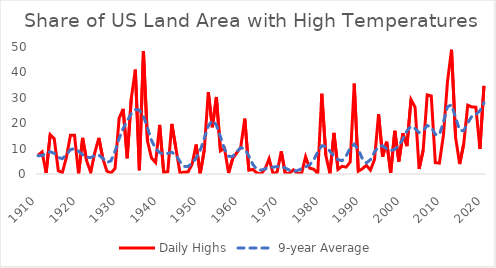
| Category | Daily Highs | 9-year Average |
|---|---|---|
| 1910.0 | 7.4 | 7.197 |
| 1911.0 | 8.7 | 7.289 |
| 1912.0 | 0.4 | 8.036 |
| 1913.0 | 15.5 | 8.762 |
| 1914.0 | 13.9 | 8.141 |
| 1915.0 | 1.3 | 6.507 |
| 1916.0 | 0.5 | 6.023 |
| 1917.0 | 6.6 | 7.627 |
| 1918.0 | 15.3 | 9.588 |
| 1919.0 | 15.3 | 9.991 |
| 1920.0 | 0 | 8.955 |
| 1921.0 | 14.2 | 7.581 |
| 1922.0 | 5.2 | 6.583 |
| 1923.0 | 0.6 | 6.497 |
| 1924.0 | 8.4 | 7.239 |
| 1925.0 | 14.2 | 7.458 |
| 1926.0 | 6 | 6.143 |
| 1927.0 | 1.1 | 4.544 |
| 1928.0 | 0.4 | 5.184 |
| 1929.0 | 2.2 | 8.953 |
| 1930.0 | 21.9 | 13.938 |
| 1931.0 | 25.6 | 17.943 |
| 1932.0 | 6.2 | 20.989 |
| 1933.0 | 29.7 | 23.688 |
| 1934.0 | 41.1 | 25.352 |
| 1935.0 | 1.5 | 25.167 |
| 1936.0 | 48.4 | 22.759 |
| 1937.0 | 13 | 18.183 |
| 1938.0 | 6.3 | 13.188 |
| 1939.0 | 4.5 | 9.952 |
| 1940.0 | 19.3 | 8.453 |
| 1941.0 | 0.7 | 7.822 |
| 1942.0 | 0.9 | 8.108 |
| 1943.0 | 19.7 | 8.57 |
| 1944.0 | 10.1 | 7.493 |
| 1945.0 | 0.5 | 4.936 |
| 1946.0 | 0.7 | 2.978 |
| 1947.0 | 0.8 | 2.959 |
| 1948.0 | 3.8 | 4.311 |
| 1949.0 | 11.6 | 6.232 |
| 1950.0 | 0.1 | 9.258 |
| 1951.0 | 9.3 | 13.994 |
| 1952.0 | 32.2 | 18.89 |
| 1953.0 | 18.4 | 21.081 |
| 1954.0 | 30.3 | 19.254 |
| 1955.0 | 9.1 | 14.645 |
| 1956.0 | 10.1 | 9.811 |
| 1957.0 | 0.4 | 6.966 |
| 1958.0 | 6 | 6.887 |
| 1959.0 | 8.3 | 8.712 |
| 1960.0 | 10.5 | 10.386 |
| 1961.0 | 21.8 | 9.892 |
| 1962.0 | 1.5 | 7.055 |
| 1963.0 | 1.8 | 3.739 |
| 1964.0 | 0.4 | 1.796 |
| 1965.0 | 0 | 1.514 |
| 1966.0 | 2 | 2.028 |
| 1967.0 | 6 | 2.475 |
| 1968.0 | 0 | 2.707 |
| 1969.0 | 0.9 | 2.938 |
| 1970.0 | 8.9 | 2.931 |
| 1971.0 | 0.1 | 2.344 |
| 1972.0 | 0.3 | 1.51 |
| 1973.0 | 1.6 | 1.083 |
| 1974.0 | 0.2 | 1.342 |
| 1975.0 | 0.2 | 2.082 |
| 1976.0 | 6.8 | 2.817 |
| 1977.0 | 2.3 | 3.604 |
| 1978.0 | 1.9 | 5.502 |
| 1979.0 | 0.2 | 8.716 |
| 1980.0 | 31.6 | 11.123 |
| 1981.0 | 7.3 | 10.882 |
| 1982.0 | 0.2 | 8.966 |
| 1983.0 | 16.2 | 7.085 |
| 1984.0 | 1.8 | 5.647 |
| 1985.0 | 3 | 5.242 |
| 1986.0 | 2.7 | 7.063 |
| 1987.0 | 4.7 | 10.31 |
| 1988.0 | 35.6 | 11.741 |
| 1989.0 | 1.1 | 9.599 |
| 1990.0 | 2.1 | 6.044 |
| 1991.0 | 3.4 | 4.356 |
| 1992.0 | 1.5 | 5.647 |
| 1993.0 | 5.7 | 8.634 |
| 1994.0 | 23.6 | 10.937 |
| 1995.0 | 6.8 | 11.089 |
| 1996.0 | 12.7 | 9.91 |
| 1997.0 | 0.5 | 9.216 |
| 1998.0 | 17 | 9.732 |
| 1999.0 | 4.9 | 11.258 |
| 2000.0 | 16 | 13.812 |
| 2001.0 | 11 | 16.962 |
| 2002.0 | 29.3 | 18.771 |
| 2003.0 | 26.3 | 17.87 |
| 2004.0 | 2 | 16.324 |
| 2005.0 | 9.3 | 17.134 |
| 2006.0 | 31.1 | 19.095 |
| 2007.0 | 30.7 | 18.455 |
| 2008.0 | 4.5 | 15.589 |
| 2009.0 | 4.3 | 15.439 |
| 2010.0 | 15.3 | 20.473 |
| 2011.0 | 36.4 | 26.471 |
| 2012.0 | 48.9 | 27.21 |
| 2013.0 | 14.4 | 22.204 |
| 2014.0 | 3.9 | 17.235 |
| 2015.0 | 11.8 | 17.001 |
| 2016.0 | 27.1 | 20.155 |
| 2017.0 | 26.4 | 22.671 |
| 2018.0 | 26.3 | 23.495 |
| 2019.0 | 9.9 | 24.846 |
| 2020.0 | 34.7 | 28.067 |